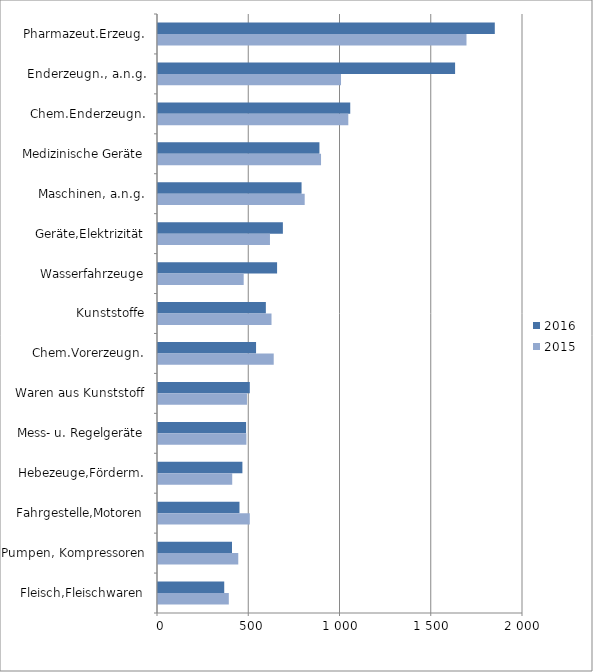
| Category | 2016 | 2015 |
|---|---|---|
| Pharmazeut.Erzeug. | 1845.479 | 1690.349 |
| Enderzeugn., a.n.g. | 1627.891 | 1002.825 |
| Chem.Enderzeugn. | 1053.379 | 1042.751 |
| Medizinische Geräte | 884.568 | 893.339 |
| Maschinen, a.n.g. | 786.632 | 803.807 |
| Geräte,Elektrizität | 684.276 | 613.546 |
| Wasserfahrzeuge | 652.517 | 469.546 |
| Kunststoffe | 590.974 | 621.978 |
| Chem.Vorerzeugn. | 537.292 | 634.087 |
| Waren aus Kunststoff | 502.977 | 487.487 |
| Mess- u. Regelgeräte | 482.661 | 484.3 |
| Hebezeuge,Förderm. | 462.484 | 406.687 |
| Fahrgestelle,Motoren | 446.485 | 502.987 |
| Pumpen, Kompressoren | 405.492 | 439.795 |
| Fleisch,Fleischwaren | 362.925 | 388.028 |